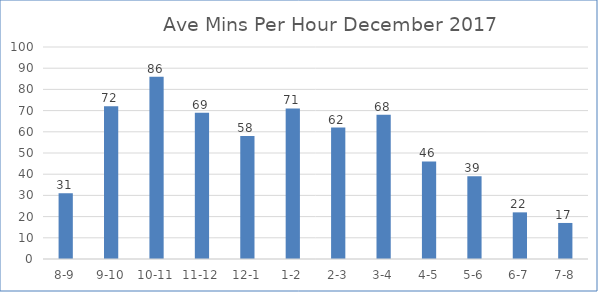
| Category | Ave Mins Per Hour  |
|---|---|
| 8-9 | 31 |
| 9-10 | 72 |
| 10-11 | 86 |
| 11-12 | 69 |
| 12-1 | 58 |
| 1-2 | 71 |
| 2-3 | 62 |
| 3-4 | 68 |
| 4-5 | 46 |
| 5-6 | 39 |
| 6-7 | 22 |
| 7-8 | 17 |